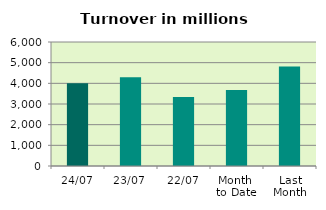
| Category | Series 0 |
|---|---|
| 24/07 | 4008.9 |
| 23/07 | 4289.297 |
| 22/07 | 3334.744 |
| Month 
to Date | 3679.828 |
| Last
Month | 4815.104 |